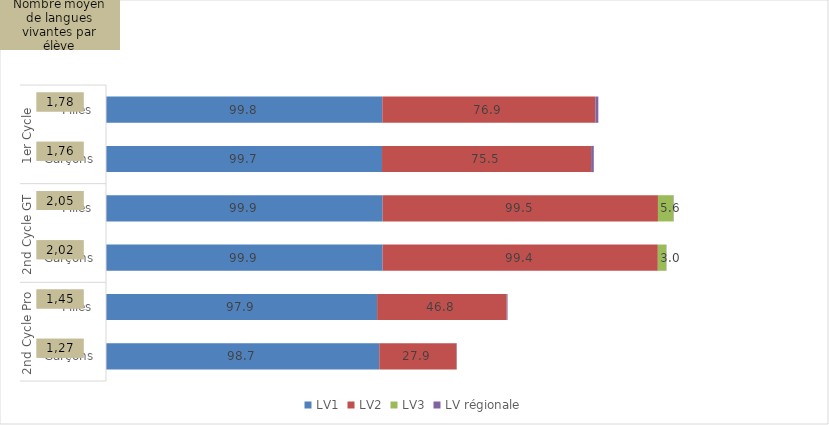
| Category | LV1 | LV2 | LV3 | LV régionale |
|---|---|---|---|---|
| 0 | 99.822 | 76.912 | 0.041 | 1.088 |
| 1 | 99.719 | 75.497 | 0.033 | 0.974 |
| 2 | 99.947 | 99.458 | 5.587 | 0.109 |
| 3 | 99.94 | 99.42 | 3.03 | 0.096 |
| 4 | 97.949 | 46.83 | 0.027 | 0.26 |
| 5 | 98.725 | 27.942 | 0.011 | 0.087 |